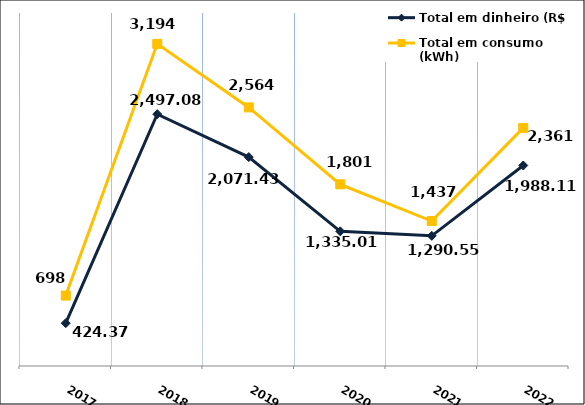
| Category | Total em dinheiro (R$) |
|---|---|
| 2017.0 | 424.37 |
| 2018.0 | 2497.08 |
| 2019.0 | 2071.43 |
| 2020.0 | 1335.01 |
| 2021.0 | 1290.55 |
| 2022.0 | 1988.11 |